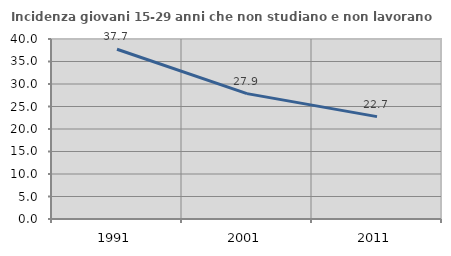
| Category | Incidenza giovani 15-29 anni che non studiano e non lavorano  |
|---|---|
| 1991.0 | 37.718 |
| 2001.0 | 27.859 |
| 2011.0 | 22.748 |